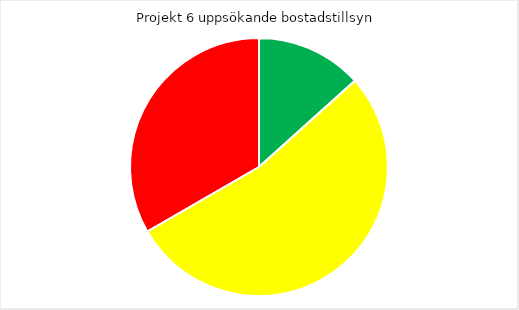
| Category | Series 0 |
|---|---|
| 0 | 2 |
| 1 | 8 |
| 2 | 5 |